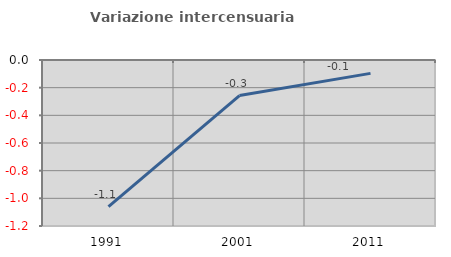
| Category | Variazione intercensuaria annua |
|---|---|
| 1991.0 | -1.06 |
| 2001.0 | -0.257 |
| 2011.0 | -0.097 |